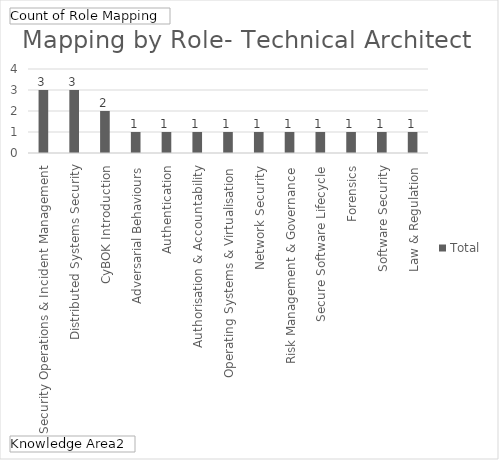
| Category | Total |
|---|---|
| Security Operations & Incident Management | 3 |
| Distributed Systems Security | 3 |
| CyBOK Introduction | 2 |
| Adversarial Behaviours | 1 |
| Authentication, Authorisation & Accountability | 1 |
| Operating Systems & Virtualisation | 1 |
| Network Security | 1 |
| Risk Management & Governance | 1 |
| Secure Software Lifecycle | 1 |
| Forensics | 1 |
| Software Security | 1 |
| Law & Regulation | 1 |
| Malware & Attack Technology | 1 |